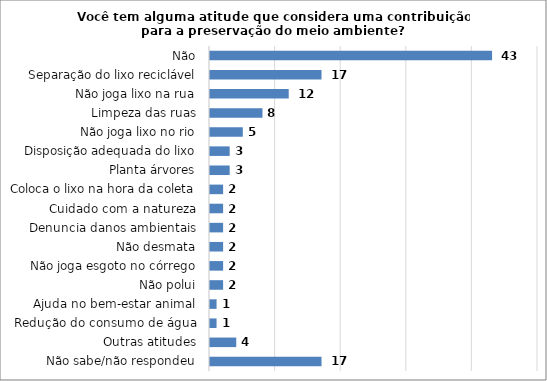
| Category | Series 0 |
|---|---|
| Não sabe/não respondeu | 17 |
| Outras atitudes | 4 |
| Redução do consumo de água | 1 |
| Ajuda no bem-estar animal | 1 |
| Não polui | 2 |
| Não joga esgoto no córrego | 2 |
| Não desmata | 2 |
| Denuncia danos ambientais | 2 |
| Cuidado com a natureza | 2 |
| Coloca o lixo na hora da coleta | 2 |
| Planta árvores | 3 |
| Disposição adequada do lixo | 3 |
| Não joga lixo no rio | 5 |
| Limpeza das ruas | 8 |
| Não joga lixo na rua | 12 |
| Separação do lixo reciclável | 17 |
| Não | 43 |